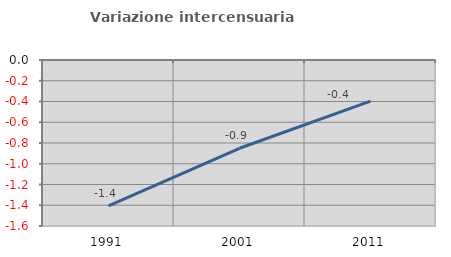
| Category | Variazione intercensuaria annua |
|---|---|
| 1991.0 | -1.406 |
| 2001.0 | -0.851 |
| 2011.0 | -0.396 |